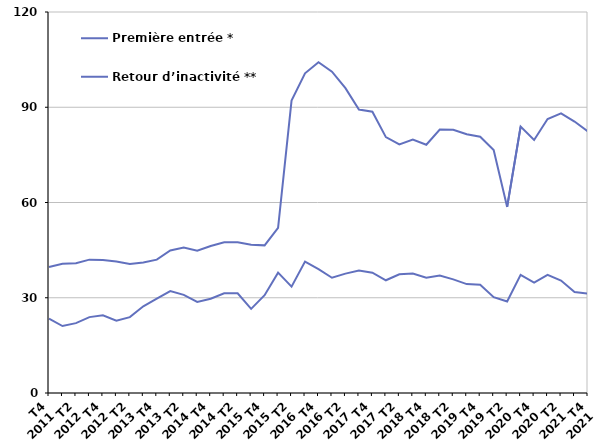
| Category | Première entrée * | Retour d’inactivité ** |
|---|---|---|
| T4
2011 | 23.4 | 39.7 |
| T1
2012 | 21.1 | 40.7 |
| T2
2012 | 22 | 40.9 |
| T3
2012 | 23.9 | 42 |
| T4
2012 | 24.5 | 41.9 |
| T1
2013 | 22.8 | 41.4 |
| T2
2013 | 23.9 | 40.6 |
| T3
2013 | 27.3 | 41.1 |
| T4
2013 | 29.7 | 42 |
| T1
2014 | 32.1 | 44.9 |
| T2
2014 | 30.9 | 45.8 |
| T3
2014 | 28.7 | 44.8 |
| T4
2014 | 29.7 | 46.3 |
| T1
2015 | 31.4 | 47.5 |
| T2
2015 | 31.4 | 47.5 |
| T3
2015 | 26.5 | 46.7 |
| T4
2015 | 30.8 | 46.5 |
| T1
2016 | 37.9 | 52 |
| T2
2016 | 33.5 | 92.1 |
| T3
2016 | 41.4 | 100.7 |
| T4
2016 | 39 | 104.2 |
| T1
2017 | 36.3 | 101.2 |
| T2
2017 | 37.6 | 96 |
| T3
2017 | 38.6 | 89.3 |
| T4
2017 | 37.9 | 88.6 |
| T1
2018 | 35.5 | 80.6 |
| T2
2018 | 37.4 | 78.3 |
| T3
2018 | 37.6 | 79.8 |
| T4
2018 | 36.3 | 78.2 |
| T1
2019 | 37 | 83 |
| T2
2019 | 35.8 | 82.9 |
| T3
2019 | 34.3 | 81.5 |
| T4
2019 | 34.1 | 80.7 |
| T1
2020 | 30.2 | 76.5 |
| T2
2020 | 28.8 | 58.6 |
| T3
2020 | 37.2 | 83.9 |
| T4
2020 | 34.8 | 79.7 |
| T1
2021 | 37.2 | 86.3 |
| T2
2021 | 35.4 | 88.1 |
| T3
2021 | 31.8 | 85.5 |
| T4
2021 | 31.3 | 82.4 |